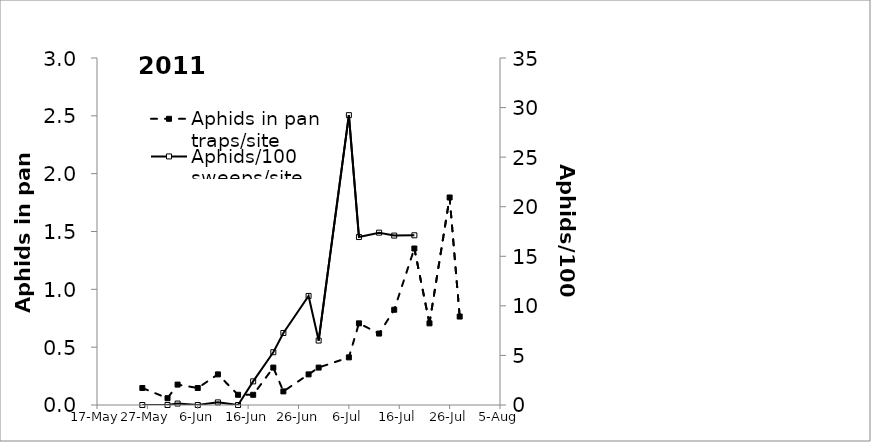
| Category | Aphids in pan traps/site |
|---|---|
| 40689.0 | 0.147 |
| 40694.0 | 0.059 |
| 40696.0 | 0.176 |
| 40700.0 | 0.147 |
| 40704.0 | 0.265 |
| 40708.0 | 0.088 |
| 40711.0 | 0.088 |
| 40715.0 | 0.324 |
| 40717.0 | 0.118 |
| 40722.0 | 0.265 |
| 40724.0 | 0.324 |
| 40730.0 | 0.412 |
| 40732.0 | 0.706 |
| 40736.0 | 0.618 |
| 40739.0 | 0.824 |
| 40743.0 | 1.353 |
| 40746.0 | 0.706 |
| 40750.0 | 1.794 |
| 40752.0 | 0.765 |